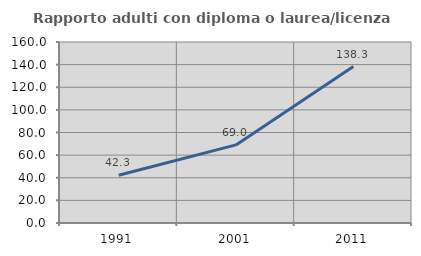
| Category | Rapporto adulti con diploma o laurea/licenza media  |
|---|---|
| 1991.0 | 42.254 |
| 2001.0 | 69.022 |
| 2011.0 | 138.286 |